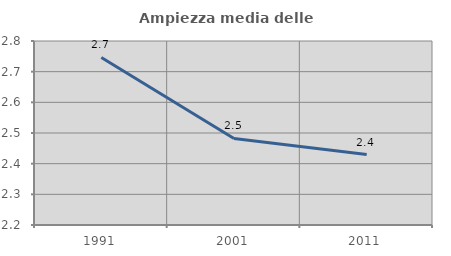
| Category | Ampiezza media delle famiglie |
|---|---|
| 1991.0 | 2.746 |
| 2001.0 | 2.482 |
| 2011.0 | 2.43 |